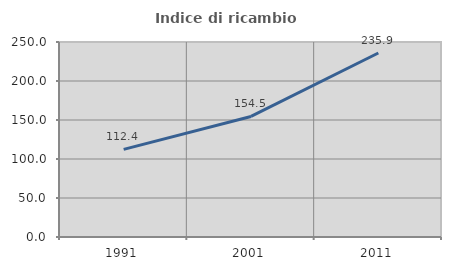
| Category | Indice di ricambio occupazionale  |
|---|---|
| 1991.0 | 112.389 |
| 2001.0 | 154.545 |
| 2011.0 | 235.938 |